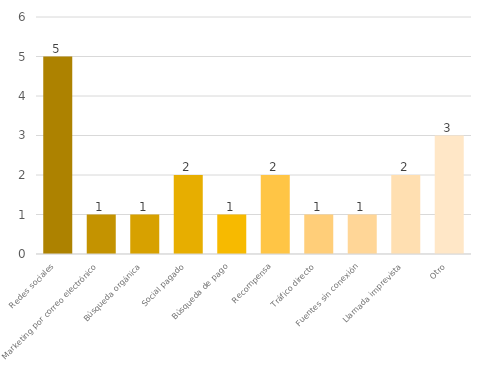
| Category | Series 0 |
|---|---|
| Redes sociales | 5 |
| Marketing por correo electrónico | 1 |
| Búsqueda orgánica | 1 |
| Social pagado | 2 |
| Búsqueda de pago | 1 |
| Recompensa | 2 |
| Tráfico directo | 1 |
| Fuentes sin conexión | 1 |
| Llamada imprevista | 2 |
| Otro | 3 |